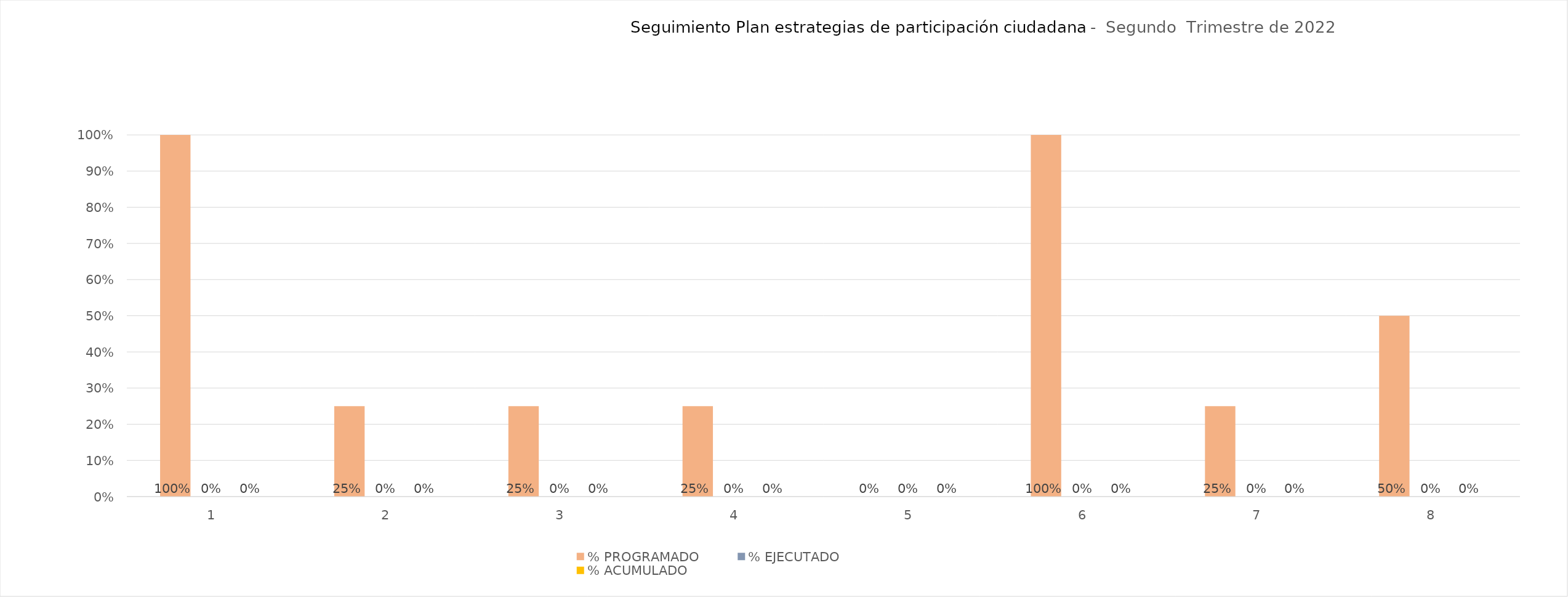
| Category | % PROGRAMADO | % EJECUTADO | % ACUMULADO |
|---|---|---|---|
| 1.0 | 1 | 0 | 0 |
| 2.0 | 0.25 | 0 | 0 |
| 3.0 | 0.25 | 0 | 0 |
| 4.0 | 0.25 | 0 | 0 |
| 5.0 | 0 | 0 | 0 |
| 6.0 | 1 | 0 | 0 |
| 7.0 | 0.25 | 0 | 0 |
| 8.0 | 0.5 | 0 | 0 |